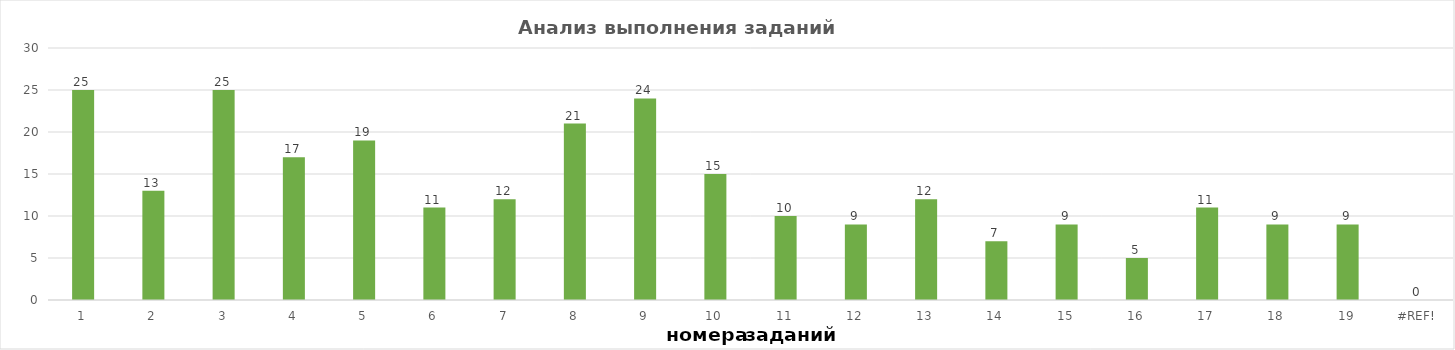
| Category | задания |
|---|---|
| 1.0 | 25 |
| 2.0 | 13 |
| 3.0 | 25 |
| 4.0 | 17 |
| 5.0 | 19 |
| 6.0 | 11 |
| 7.0 | 12 |
| 8.0 | 21 |
| 9.0 | 24 |
| 10.0 | 15 |
| 11.0 | 10 |
| 12.0 | 9 |
| 13.0 | 12 |
| 14.0 | 7 |
| 15.0 | 9 |
| 16.0 | 5 |
| 17.0 | 11 |
| 18.0 | 9 |
| 19.0 | 9 |
| 0.0 | 0 |